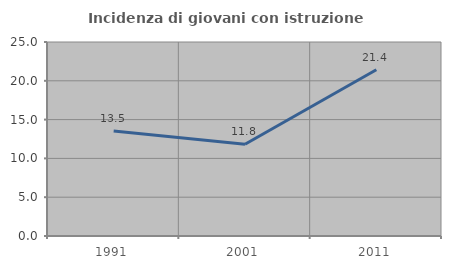
| Category | Incidenza di giovani con istruzione universitaria |
|---|---|
| 1991.0 | 13.525 |
| 2001.0 | 11.824 |
| 2011.0 | 21.429 |